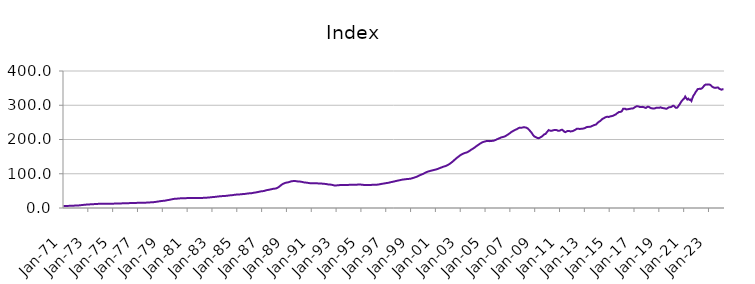
| Category | Index |
|---|---|
| 1971-01-01 | 5.879 |
| 1971-02-01 | 5.921 |
| 1971-03-01 | 5.963 |
| 1971-04-01 | 6.018 |
| 1971-05-01 | 6.108 |
| 1971-06-01 | 6.203 |
| 1971-07-01 | 6.32 |
| 1971-08-01 | 6.446 |
| 1971-09-01 | 6.572 |
| 1971-10-01 | 6.703 |
| 1971-11-01 | 6.844 |
| 1971-12-01 | 7.015 |
| 1972-01-01 | 7.135 |
| 1972-02-01 | 7.213 |
| 1972-03-01 | 7.39 |
| 1972-04-01 | 7.638 |
| 1972-05-01 | 7.997 |
| 1972-06-01 | 8.312 |
| 1972-07-01 | 8.674 |
| 1972-08-01 | 9.023 |
| 1972-09-01 | 9.332 |
| 1972-10-01 | 9.62 |
| 1972-11-01 | 9.887 |
| 1972-12-01 | 10.162 |
| 1973-01-01 | 10.359 |
| 1973-02-01 | 10.498 |
| 1973-03-01 | 10.658 |
| 1973-04-01 | 10.841 |
| 1973-05-01 | 11.075 |
| 1973-06-01 | 11.227 |
| 1973-07-01 | 11.386 |
| 1973-08-01 | 11.562 |
| 1973-09-01 | 11.768 |
| 1973-10-01 | 11.982 |
| 1973-11-01 | 12.145 |
| 1973-12-01 | 12.262 |
| 1974-01-01 | 12.324 |
| 1974-02-01 | 12.392 |
| 1974-03-01 | 12.389 |
| 1974-04-01 | 12.362 |
| 1974-05-01 | 12.339 |
| 1974-06-01 | 12.34 |
| 1974-07-01 | 12.352 |
| 1974-08-01 | 12.392 |
| 1974-09-01 | 12.465 |
| 1974-10-01 | 12.555 |
| 1974-11-01 | 12.63 |
| 1974-12-01 | 12.703 |
| 1975-01-01 | 12.737 |
| 1975-02-01 | 12.78 |
| 1975-03-01 | 12.857 |
| 1975-04-01 | 12.965 |
| 1975-05-01 | 13.097 |
| 1975-06-01 | 13.168 |
| 1975-07-01 | 13.237 |
| 1975-08-01 | 13.332 |
| 1975-09-01 | 13.462 |
| 1975-10-01 | 13.606 |
| 1975-11-01 | 13.732 |
| 1975-12-01 | 13.867 |
| 1976-01-01 | 13.963 |
| 1976-02-01 | 14.052 |
| 1976-03-01 | 14.114 |
| 1976-04-01 | 14.179 |
| 1976-05-01 | 14.264 |
| 1976-06-01 | 14.32 |
| 1976-07-01 | 14.382 |
| 1976-08-01 | 14.474 |
| 1976-09-01 | 14.605 |
| 1976-10-01 | 14.752 |
| 1976-11-01 | 14.87 |
| 1976-12-01 | 14.976 |
| 1977-01-01 | 15.034 |
| 1977-02-01 | 15.102 |
| 1977-03-01 | 15.145 |
| 1977-04-01 | 15.197 |
| 1977-05-01 | 15.276 |
| 1977-06-01 | 15.347 |
| 1977-07-01 | 15.436 |
| 1977-08-01 | 15.557 |
| 1977-09-01 | 15.705 |
| 1977-10-01 | 15.871 |
| 1977-11-01 | 16.048 |
| 1977-12-01 | 16.278 |
| 1978-01-01 | 16.449 |
| 1978-02-01 | 16.582 |
| 1978-03-01 | 16.762 |
| 1978-04-01 | 17.003 |
| 1978-05-01 | 17.391 |
| 1978-06-01 | 17.783 |
| 1978-07-01 | 18.258 |
| 1978-08-01 | 18.744 |
| 1978-09-01 | 19.213 |
| 1978-10-01 | 19.678 |
| 1978-11-01 | 20.113 |
| 1978-12-01 | 20.542 |
| 1979-01-01 | 20.797 |
| 1979-02-01 | 20.968 |
| 1979-03-01 | 21.394 |
| 1979-04-01 | 21.979 |
| 1979-05-01 | 22.725 |
| 1979-06-01 | 23.198 |
| 1979-07-01 | 23.69 |
| 1979-08-01 | 24.243 |
| 1979-09-01 | 24.906 |
| 1979-10-01 | 25.613 |
| 1979-11-01 | 26.202 |
| 1979-12-01 | 26.66 |
| 1980-01-01 | 26.911 |
| 1980-02-01 | 27.107 |
| 1980-03-01 | 27.357 |
| 1980-04-01 | 27.651 |
| 1980-05-01 | 27.994 |
| 1980-06-01 | 28.178 |
| 1980-07-01 | 28.344 |
| 1980-08-01 | 28.498 |
| 1980-09-01 | 28.607 |
| 1980-10-01 | 28.676 |
| 1980-11-01 | 28.73 |
| 1980-12-01 | 28.843 |
| 1981-01-01 | 28.911 |
| 1981-02-01 | 29.013 |
| 1981-03-01 | 29.116 |
| 1981-04-01 | 29.254 |
| 1981-05-01 | 29.394 |
| 1981-06-01 | 29.441 |
| 1981-07-01 | 29.464 |
| 1981-08-01 | 29.469 |
| 1981-09-01 | 29.414 |
| 1981-10-01 | 29.312 |
| 1981-11-01 | 29.219 |
| 1981-12-01 | 29.209 |
| 1982-01-01 | 29.164 |
| 1982-02-01 | 29.184 |
| 1982-03-01 | 29.346 |
| 1982-04-01 | 29.618 |
| 1982-05-01 | 29.924 |
| 1982-06-01 | 30.035 |
| 1982-07-01 | 30.119 |
| 1982-08-01 | 30.28 |
| 1982-09-01 | 30.54 |
| 1982-10-01 | 30.849 |
| 1982-11-01 | 31.157 |
| 1982-12-01 | 31.538 |
| 1983-01-01 | 31.828 |
| 1983-02-01 | 32.078 |
| 1983-03-01 | 32.337 |
| 1983-04-01 | 32.659 |
| 1983-05-01 | 33.081 |
| 1983-06-01 | 33.413 |
| 1983-07-01 | 33.773 |
| 1983-08-01 | 34.116 |
| 1983-09-01 | 34.39 |
| 1983-10-01 | 34.614 |
| 1983-11-01 | 34.826 |
| 1983-12-01 | 35.104 |
| 1984-01-01 | 35.27 |
| 1984-02-01 | 35.438 |
| 1984-03-01 | 35.758 |
| 1984-04-01 | 36.202 |
| 1984-05-01 | 36.71 |
| 1984-06-01 | 36.936 |
| 1984-07-01 | 37.124 |
| 1984-08-01 | 37.411 |
| 1984-09-01 | 37.87 |
| 1984-10-01 | 38.4 |
| 1984-11-01 | 38.81 |
| 1984-12-01 | 39.095 |
| 1985-01-01 | 39.174 |
| 1985-02-01 | 39.283 |
| 1985-03-01 | 39.552 |
| 1985-04-01 | 39.93 |
| 1985-05-01 | 40.361 |
| 1985-06-01 | 40.527 |
| 1985-07-01 | 40.681 |
| 1985-08-01 | 40.948 |
| 1985-09-01 | 41.393 |
| 1985-10-01 | 41.902 |
| 1985-11-01 | 42.329 |
| 1985-12-01 | 42.671 |
| 1986-01-01 | 42.803 |
| 1986-02-01 | 42.939 |
| 1986-03-01 | 43.335 |
| 1986-04-01 | 43.908 |
| 1986-05-01 | 44.624 |
| 1986-06-01 | 45.057 |
| 1986-07-01 | 45.499 |
| 1986-08-01 | 46.028 |
| 1986-09-01 | 46.692 |
| 1986-10-01 | 47.409 |
| 1986-11-01 | 48.06 |
| 1986-12-01 | 48.667 |
| 1987-01-01 | 49.02 |
| 1987-02-01 | 49.311 |
| 1987-03-01 | 49.944 |
| 1987-04-01 | 50.795 |
| 1987-05-01 | 51.813 |
| 1987-06-01 | 52.387 |
| 1987-07-01 | 52.937 |
| 1987-08-01 | 53.541 |
| 1987-09-01 | 54.197 |
| 1987-10-01 | 54.877 |
| 1987-11-01 | 55.513 |
| 1987-12-01 | 56.172 |
| 1988-01-01 | 56.486 |
| 1988-02-01 | 56.756 |
| 1988-03-01 | 57.701 |
| 1988-04-01 | 59.124 |
| 1988-05-01 | 61.264 |
| 1988-06-01 | 63.424 |
| 1988-07-01 | 65.968 |
| 1988-08-01 | 68.307 |
| 1988-09-01 | 70.109 |
| 1988-10-01 | 71.604 |
| 1988-11-01 | 72.807 |
| 1988-12-01 | 73.875 |
| 1989-01-01 | 74.434 |
| 1989-02-01 | 74.906 |
| 1989-03-01 | 75.707 |
| 1989-04-01 | 76.727 |
| 1989-05-01 | 77.807 |
| 1989-06-01 | 78.279 |
| 1989-07-01 | 78.601 |
| 1989-08-01 | 78.752 |
| 1989-09-01 | 78.622 |
| 1989-10-01 | 78.258 |
| 1989-11-01 | 77.774 |
| 1989-12-01 | 77.38 |
| 1990-01-01 | 77.025 |
| 1990-02-01 | 77.011 |
| 1990-03-01 | 76.482 |
| 1990-04-01 | 75.796 |
| 1990-05-01 | 74.994 |
| 1990-06-01 | 74.611 |
| 1990-07-01 | 74.285 |
| 1990-08-01 | 73.967 |
| 1990-09-01 | 73.52 |
| 1990-10-01 | 73.009 |
| 1990-11-01 | 72.535 |
| 1990-12-01 | 72.334 |
| 1991-01-01 | 72.192 |
| 1991-02-01 | 72.268 |
| 1991-03-01 | 72.153 |
| 1991-04-01 | 72.077 |
| 1991-05-01 | 71.977 |
| 1991-06-01 | 71.933 |
| 1991-07-01 | 71.885 |
| 1991-08-01 | 71.819 |
| 1991-09-01 | 71.705 |
| 1991-10-01 | 71.501 |
| 1991-11-01 | 71.166 |
| 1991-12-01 | 70.813 |
| 1992-01-01 | 70.463 |
| 1992-02-01 | 70.409 |
| 1992-03-01 | 69.918 |
| 1992-04-01 | 69.325 |
| 1992-05-01 | 68.671 |
| 1992-06-01 | 68.457 |
| 1992-07-01 | 68.303 |
| 1992-08-01 | 67.98 |
| 1992-09-01 | 67.29 |
| 1992-10-01 | 66.434 |
| 1992-11-01 | 65.854 |
| 1992-12-01 | 65.871 |
| 1993-01-01 | 66.034 |
| 1993-02-01 | 66.322 |
| 1993-03-01 | 66.581 |
| 1993-04-01 | 66.905 |
| 1993-05-01 | 67.182 |
| 1993-06-01 | 67.213 |
| 1993-07-01 | 67.233 |
| 1993-08-01 | 67.289 |
| 1993-09-01 | 67.247 |
| 1993-10-01 | 67.126 |
| 1993-11-01 | 67.046 |
| 1993-12-01 | 67.281 |
| 1994-01-01 | 67.604 |
| 1994-02-01 | 68.006 |
| 1994-03-01 | 67.991 |
| 1994-04-01 | 67.827 |
| 1994-05-01 | 67.683 |
| 1994-06-01 | 67.696 |
| 1994-07-01 | 67.777 |
| 1994-08-01 | 67.944 |
| 1994-09-01 | 68.21 |
| 1994-10-01 | 68.532 |
| 1994-11-01 | 68.685 |
| 1994-12-01 | 68.595 |
| 1995-01-01 | 68.092 |
| 1995-02-01 | 67.66 |
| 1995-03-01 | 67.497 |
| 1995-04-01 | 67.327 |
| 1995-05-01 | 67.356 |
| 1995-06-01 | 67.213 |
| 1995-07-01 | 67.36 |
| 1995-08-01 | 67.425 |
| 1995-09-01 | 67.463 |
| 1995-10-01 | 67.439 |
| 1995-11-01 | 67.524 |
| 1995-12-01 | 67.607 |
| 1996-01-01 | 67.632 |
| 1996-02-01 | 67.59 |
| 1996-03-01 | 67.814 |
| 1996-04-01 | 68.077 |
| 1996-05-01 | 68.578 |
| 1996-06-01 | 68.945 |
| 1996-07-01 | 69.543 |
| 1996-08-01 | 70.122 |
| 1996-09-01 | 70.708 |
| 1996-10-01 | 71.134 |
| 1996-11-01 | 71.585 |
| 1996-12-01 | 72.224 |
| 1997-01-01 | 72.682 |
| 1997-02-01 | 73.17 |
| 1997-03-01 | 73.587 |
| 1997-04-01 | 74.264 |
| 1997-05-01 | 75.148 |
| 1997-06-01 | 75.819 |
| 1997-07-01 | 76.292 |
| 1997-08-01 | 77.048 |
| 1997-09-01 | 77.723 |
| 1997-10-01 | 78.598 |
| 1997-11-01 | 79.21 |
| 1997-12-01 | 79.988 |
| 1998-01-01 | 80.449 |
| 1998-02-01 | 81.141 |
| 1998-03-01 | 81.745 |
| 1998-04-01 | 82.495 |
| 1998-05-01 | 83.027 |
| 1998-06-01 | 83.355 |
| 1998-07-01 | 83.747 |
| 1998-08-01 | 84.113 |
| 1998-09-01 | 84.484 |
| 1998-10-01 | 84.731 |
| 1998-11-01 | 85.018 |
| 1998-12-01 | 85.363 |
| 1999-01-01 | 85.875 |
| 1999-02-01 | 86.896 |
| 1999-03-01 | 87.796 |
| 1999-04-01 | 88.688 |
| 1999-05-01 | 89.666 |
| 1999-06-01 | 90.701 |
| 1999-07-01 | 91.918 |
| 1999-08-01 | 93.495 |
| 1999-09-01 | 95.101 |
| 1999-10-01 | 96.577 |
| 1999-11-01 | 97.58 |
| 1999-12-01 | 98.926 |
| 2000-01-01 | 100 |
| 2000-02-01 | 101.936 |
| 2000-03-01 | 103.455 |
| 2000-04-01 | 105.075 |
| 2000-05-01 | 105.895 |
| 2000-06-01 | 106.901 |
| 2000-07-01 | 107.798 |
| 2000-08-01 | 108.633 |
| 2000-09-01 | 109.409 |
| 2000-10-01 | 110.207 |
| 2000-11-01 | 110.863 |
| 2000-12-01 | 111.699 |
| 2001-01-01 | 112.376 |
| 2001-02-01 | 113.427 |
| 2001-03-01 | 114.41 |
| 2001-04-01 | 115.617 |
| 2001-05-01 | 116.92 |
| 2001-06-01 | 118 |
| 2001-07-01 | 119.178 |
| 2001-08-01 | 120.352 |
| 2001-09-01 | 121.415 |
| 2001-10-01 | 122.129 |
| 2001-11-01 | 123.346 |
| 2001-12-01 | 124.695 |
| 2002-01-01 | 126.498 |
| 2002-02-01 | 128.249 |
| 2002-03-01 | 130.341 |
| 2002-04-01 | 132.594 |
| 2002-05-01 | 135.137 |
| 2002-06-01 | 137.714 |
| 2002-07-01 | 140.534 |
| 2002-08-01 | 143.04 |
| 2002-09-01 | 145.7 |
| 2002-10-01 | 148.191 |
| 2002-11-01 | 150.379 |
| 2002-12-01 | 152.788 |
| 2003-01-01 | 154.938 |
| 2003-02-01 | 156.702 |
| 2003-03-01 | 158.127 |
| 2003-04-01 | 159.492 |
| 2003-05-01 | 160.649 |
| 2003-06-01 | 161.58 |
| 2003-07-01 | 162.401 |
| 2003-08-01 | 164.014 |
| 2003-09-01 | 165.699 |
| 2003-10-01 | 167.901 |
| 2003-11-01 | 170.039 |
| 2003-12-01 | 171.829 |
| 2004-01-01 | 173.609 |
| 2004-02-01 | 175.589 |
| 2004-03-01 | 177.991 |
| 2004-04-01 | 180.138 |
| 2004-05-01 | 182.465 |
| 2004-06-01 | 184.54 |
| 2004-07-01 | 186.551 |
| 2004-08-01 | 188.625 |
| 2004-09-01 | 190.257 |
| 2004-10-01 | 192.019 |
| 2004-11-01 | 192.962 |
| 2004-12-01 | 193.904 |
| 2005-01-01 | 194.627 |
| 2005-02-01 | 195.72 |
| 2005-03-01 | 195.655 |
| 2005-04-01 | 195.754 |
| 2005-05-01 | 195.194 |
| 2005-06-01 | 195.793 |
| 2005-07-01 | 195.867 |
| 2005-08-01 | 196.175 |
| 2005-09-01 | 196.736 |
| 2005-10-01 | 197.938 |
| 2005-11-01 | 198.884 |
| 2005-12-01 | 200.645 |
| 2006-01-01 | 201.661 |
| 2006-02-01 | 203.374 |
| 2006-03-01 | 204.511 |
| 2006-04-01 | 205.861 |
| 2006-05-01 | 206.826 |
| 2006-06-01 | 207.511 |
| 2006-07-01 | 208.388 |
| 2006-08-01 | 209.567 |
| 2006-09-01 | 211.353 |
| 2006-10-01 | 213.443 |
| 2006-11-01 | 215.14 |
| 2006-12-01 | 217.475 |
| 2007-01-01 | 219.496 |
| 2007-02-01 | 222.231 |
| 2007-03-01 | 223.7 |
| 2007-04-01 | 225.58 |
| 2007-05-01 | 226.869 |
| 2007-06-01 | 228.812 |
| 2007-07-01 | 229.701 |
| 2007-08-01 | 231.63 |
| 2007-09-01 | 233.384 |
| 2007-10-01 | 234.664 |
| 2007-11-01 | 234.312 |
| 2007-12-01 | 234.555 |
| 2008-01-01 | 235.086 |
| 2008-02-01 | 236.026 |
| 2008-03-01 | 235.364 |
| 2008-04-01 | 234.965 |
| 2008-05-01 | 233.6 |
| 2008-06-01 | 231.702 |
| 2008-07-01 | 228.29 |
| 2008-08-01 | 225.152 |
| 2008-09-01 | 221.485 |
| 2008-10-01 | 217.485 |
| 2008-11-01 | 212.758 |
| 2008-12-01 | 209.323 |
| 2009-01-01 | 207.652 |
| 2009-02-01 | 206.212 |
| 2009-03-01 | 204.576 |
| 2009-04-01 | 203.86 |
| 2009-05-01 | 204.572 |
| 2009-06-01 | 206.247 |
| 2009-07-01 | 207.906 |
| 2009-08-01 | 210.209 |
| 2009-09-01 | 213.072 |
| 2009-10-01 | 215.548 |
| 2009-11-01 | 216.169 |
| 2009-12-01 | 220.435 |
| 2010-01-01 | 223.882 |
| 2010-02-01 | 227.544 |
| 2010-03-01 | 226.207 |
| 2010-04-01 | 225.371 |
| 2010-05-01 | 225.616 |
| 2010-06-01 | 226.496 |
| 2010-07-01 | 227.242 |
| 2010-08-01 | 228.031 |
| 2010-09-01 | 227.934 |
| 2010-10-01 | 227.086 |
| 2010-11-01 | 225.565 |
| 2010-12-01 | 225.596 |
| 2011-01-01 | 226.214 |
| 2011-02-01 | 228.039 |
| 2011-03-01 | 228.503 |
| 2011-04-01 | 226.162 |
| 2011-05-01 | 223.102 |
| 2011-06-01 | 221.419 |
| 2011-07-01 | 222.781 |
| 2011-08-01 | 224.513 |
| 2011-09-01 | 224.472 |
| 2011-10-01 | 224.841 |
| 2011-11-01 | 223.579 |
| 2011-12-01 | 223.822 |
| 2012-01-01 | 224.584 |
| 2012-02-01 | 225.473 |
| 2012-03-01 | 227.466 |
| 2012-04-01 | 228.575 |
| 2012-05-01 | 231.11 |
| 2012-06-01 | 231.251 |
| 2012-07-01 | 231.282 |
| 2012-08-01 | 230.612 |
| 2012-09-01 | 231.126 |
| 2012-10-01 | 231.503 |
| 2012-11-01 | 231.747 |
| 2012-12-01 | 232.346 |
| 2013-01-01 | 233.26 |
| 2013-02-01 | 235.199 |
| 2013-03-01 | 236.287 |
| 2013-04-01 | 236.897 |
| 2013-05-01 | 236.822 |
| 2013-06-01 | 237.016 |
| 2013-07-01 | 237.888 |
| 2013-08-01 | 239.493 |
| 2013-09-01 | 240.786 |
| 2013-10-01 | 242.115 |
| 2013-11-01 | 242.898 |
| 2013-12-01 | 244.057 |
| 2014-01-01 | 247.816 |
| 2014-02-01 | 250.169 |
| 2014-03-01 | 252.769 |
| 2014-04-01 | 254.326 |
| 2014-05-01 | 257.246 |
| 2014-06-01 | 260.069 |
| 2014-07-01 | 261.53 |
| 2014-08-01 | 263.472 |
| 2014-09-01 | 264.905 |
| 2014-10-01 | 266.07 |
| 2014-11-01 | 266.347 |
| 2014-12-01 | 265.659 |
| 2015-01-01 | 266.928 |
| 2015-02-01 | 267.88 |
| 2015-03-01 | 268.307 |
| 2015-04-01 | 269.155 |
| 2015-05-01 | 270.34 |
| 2015-06-01 | 272.163 |
| 2015-07-01 | 273.277 |
| 2015-08-01 | 276.288 |
| 2015-09-01 | 278.116 |
| 2015-10-01 | 280.486 |
| 2015-11-01 | 280.294 |
| 2015-12-01 | 281.199 |
| 2016-01-01 | 283.607 |
| 2016-02-01 | 289.619 |
| 2016-03-01 | 290.057 |
| 2016-04-01 | 289.886 |
| 2016-05-01 | 287.681 |
| 2016-06-01 | 288.483 |
| 2016-07-01 | 288.661 |
| 2016-08-01 | 289.259 |
| 2016-09-01 | 289.711 |
| 2016-10-01 | 290.701 |
| 2016-11-01 | 290.463 |
| 2016-12-01 | 291.375 |
| 2017-01-01 | 293.717 |
| 2017-02-01 | 295.456 |
| 2017-03-01 | 297.078 |
| 2017-04-01 | 296.912 |
| 2017-05-01 | 296.553 |
| 2017-06-01 | 295.078 |
| 2017-07-01 | 294.677 |
| 2017-08-01 | 294.669 |
| 2017-09-01 | 295.305 |
| 2017-10-01 | 294.345 |
| 2017-11-01 | 293.162 |
| 2017-12-01 | 292.069 |
| 2018-01-01 | 294.449 |
| 2018-02-01 | 295.846 |
| 2018-03-01 | 294.92 |
| 2018-04-01 | 292.924 |
| 2018-05-01 | 291.472 |
| 2018-06-01 | 291.002 |
| 2018-07-01 | 290.236 |
| 2018-08-01 | 290.758 |
| 2018-09-01 | 291.058 |
| 2018-10-01 | 292.824 |
| 2018-11-01 | 292.65 |
| 2018-12-01 | 292.367 |
| 2019-01-01 | 292.519 |
| 2019-02-01 | 293.9 |
| 2019-03-01 | 292.871 |
| 2019-04-01 | 291.841 |
| 2019-05-01 | 291.513 |
| 2019-06-01 | 290.998 |
| 2019-07-01 | 290.148 |
| 2019-08-01 | 289.99 |
| 2019-09-01 | 291.573 |
| 2019-10-01 | 293.571 |
| 2019-11-01 | 294.348 |
| 2019-12-01 | 294.551 |
| 2020-01-01 | 295.866 |
| 2020-02-01 | 298.222 |
| 2020-03-01 | 298.209 |
| 2020-04-01 | 295.219 |
| 2020-05-01 | 292.362 |
| 2020-06-01 | 292.368 |
| 2020-07-01 | 295.543 |
| 2020-08-01 | 300.082 |
| 2020-09-01 | 304.427 |
| 2020-10-01 | 309.885 |
| 2020-11-01 | 313.48 |
| 2020-12-01 | 317.137 |
| 2021-01-01 | 319.695 |
| 2021-02-01 | 325.476 |
| 2021-03-01 | 320.757 |
| 2021-04-01 | 316.769 |
| 2021-05-01 | 319.181 |
| 2021-06-01 | 315.729 |
| 2021-07-01 | 316.68 |
| 2021-08-01 | 312.495 |
| 2021-09-01 | 321.495 |
| 2021-10-01 | 328.314 |
| 2021-11-01 | 332.529 |
| 2021-12-01 | 338.25 |
| 2022-01-01 | 341.933 |
| 2022-02-01 | 347.129 |
| 2022-03-01 | 347.568 |
| 2022-04-01 | 348.153 |
| 2022-05-01 | 347.766 |
| 2022-06-01 | 349.075 |
| 2022-07-01 | 351.786 |
| 2022-08-01 | 356.144 |
| 2022-09-01 | 358.976 |
| 2022-10-01 | 360.764 |
| 2022-11-01 | 360.102 |
| 2022-12-01 | 360.878 |
| 2023-01-01 | 360.581 |
| 2023-02-01 | 359.969 |
| 2023-03-01 | 357.491 |
| 2023-04-01 | 354.384 |
| 2023-05-01 | 352.706 |
| 2023-06-01 | 351.048 |
| 2023-07-01 | 350.705 |
| 2023-08-01 | 351.186 |
| 2023-09-01 | 351.784 |
| 2023-10-01 | 351.515 |
| 2023-11-01 | 347.875 |
| 2023-12-01 | 346.916 |
| 2024-01-01 | 345.337 |
| 2024-02-01 | 346.729 |
| 2024-03-01 | 346.936 |